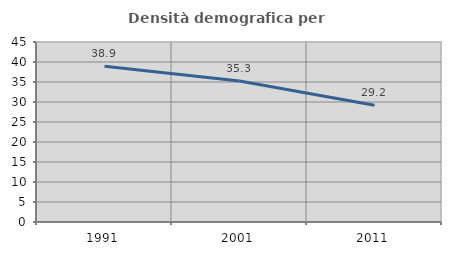
| Category | Densità demografica |
|---|---|
| 1991.0 | 38.912 |
| 2001.0 | 35.273 |
| 2011.0 | 29.17 |